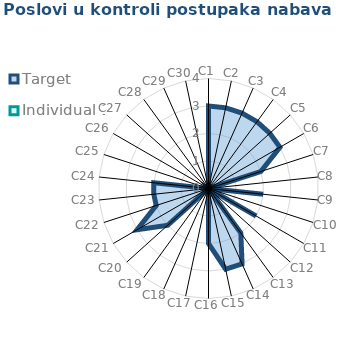
| Category | Target | Individual 1 |
|---|---|---|
| C1 | 3 | 0 |
| C2 | 3 | 0 |
| C3 | 3 | 0 |
| C4 | 3 | 0 |
| C5 | 3 | 0 |
| C6 | 3 | 0 |
| C7 | 2 | 0 |
| C8 | 0 | 0 |
| C9 | 2 | 0 |
| C10 | 0 | 0 |
| C11 | 2 | 0 |
| C12 | 0 | 0 |
| C13 | 2 | 0 |
| C14 | 3 | 0 |
| C15 | 3 | 0 |
| C16 | 2 | 0 |
| C17 | 0 | 0 |
| C18 | 0 | 0 |
| C19 | 0 | 0 |
| C20 | 2 | 0 |
| C21 | 3 | 0 |
| C22 | 2 | 0 |
| C23 | 2 | 0 |
| C24 | 2 | 0 |
| C25 | 0 | 0 |
| C26 | 0 | 0 |
| C27 | 0 | 0 |
| C28 | 0 | 0 |
| C29 | 0 | 0 |
| C30 | 0 | 0 |